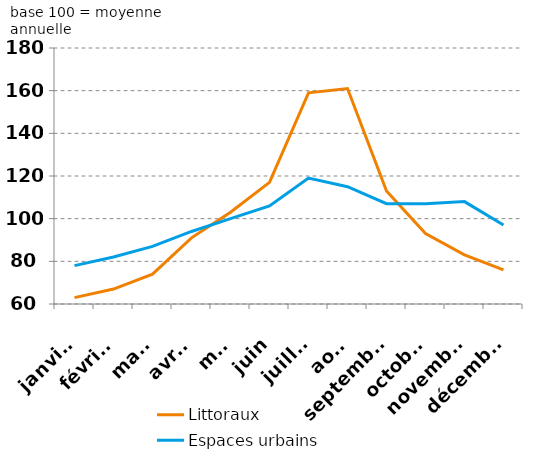
| Category | Littoraux | Espaces urbains |
|---|---|---|
| janvier | 63 | 78 |
| février | 67 | 82 |
| mars | 74 | 87 |
| avril | 91 | 94 |
| mai | 103 | 100 |
| juin | 117 | 106 |
| juillet | 159 | 119 |
| août | 161 | 115 |
| septembre | 113 | 107 |
| octobre | 93 | 107 |
| novembre | 83 | 108 |
| décembre | 76 | 97 |